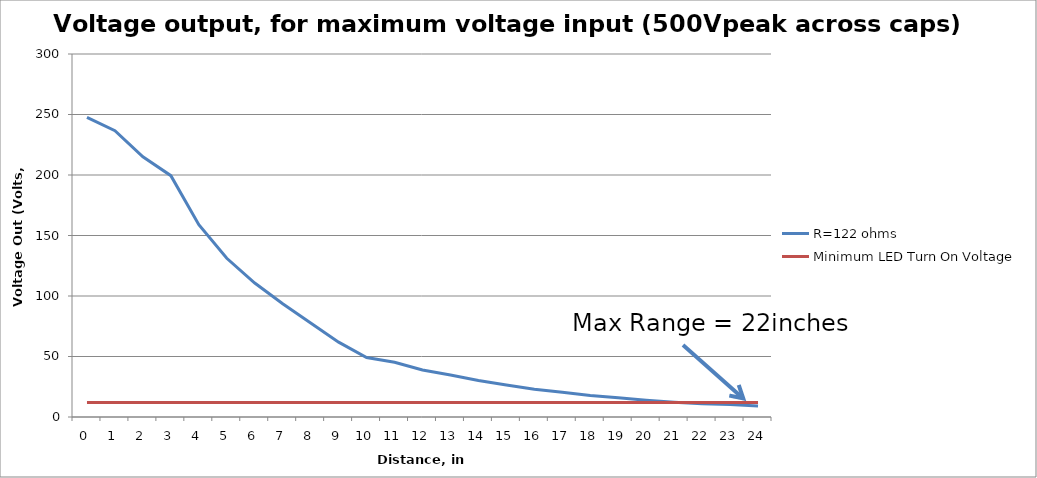
| Category | R=122 ohms | Minimum LED Turn On Voltage |
|---|---|---|
| 0.0 | 247.66 | 12 |
| 1.0 | 236.553 | 12 |
| 2.0 | 215.097 | 12 |
| 3.0 | 199.477 | 12 |
| 4.0 | 158.979 | 12 |
| 5.0 | 131.145 | 12 |
| 6.0 | 110.723 | 12 |
| 7.0 | 93.548 | 12 |
| 8.0 | 77.679 | 12 |
| 9.0 | 61.864 | 12 |
| 10.0 | 49.122 | 12 |
| 11.0 | 45.238 | 12 |
| 12.0 | 38.859 | 12 |
| 13.0 | 34.76 | 12 |
| 14.0 | 30.228 | 12 |
| 15.0 | 26.529 | 12 |
| 16.0 | 23.025 | 12 |
| 17.0 | 20.382 | 12 |
| 18.0 | 17.794 | 12 |
| 19.0 | 15.871 | 12 |
| 20.0 | 13.824 | 12 |
| 21.0 | 12.267 | 12 |
| 22.0 | 10.897 | 12 |
| 23.0 | 10.232 | 12 |
| 24.0 | 9.109 | 12 |